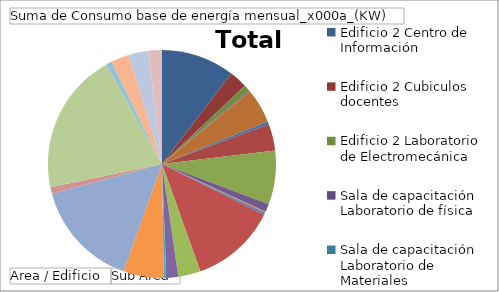
| Category | Total |
|---|---|
| 0 | 907.76 |
| 1 | 220.5 |
| 2 | 74.476 |
| 3 | 11.6 |
| 4 | 6 |
| 5 | 427 |
| 6 | 37.58 |
| 7 | 328.125 |
| 8 | 667.75 |
| 9 | 96.048 |
| 10 | 0.96 |
| 11 | 15 |
| 12 | 24.6 |
| 13 | 1064.25 |
| 14 | 277.2 |
| 15 | 145.8 |
| 16 | 32.925 |
| 17 | 497.145 |
| 18 | 1336.38 |
| 19 | 79.2 |
| 20 | 1753.6 |
| 21 | 1.68 |
| 22 | 71.25 |
| 23 | 226.65 |
| 24 | 242.85 |
| 25 | 168.93 |